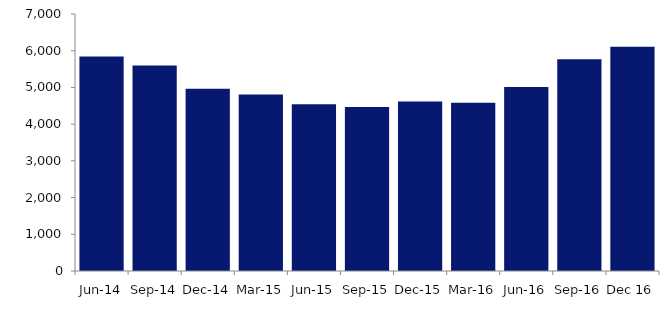
| Category | Series 0 |
|---|---|
| Jun-14 | 5840 |
| Sep-14 | 5599 |
| Dec-14 | 4964 |
| Mar-15 | 4808 |
| Jun-15 | 4541 |
| Sep-15 | 4467 |
| Dec-15 | 4619 |
| Mar-16 | 4585 |
| Jun-16 | 5012 |
| Sep-16 | 5770 |
| Dec 16 | 6110 |